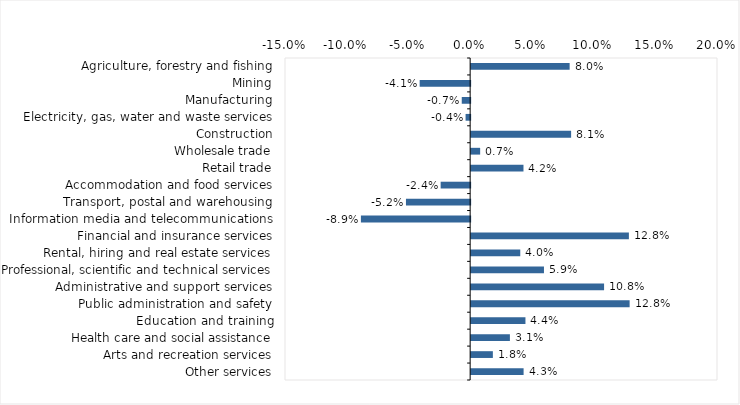
| Category | This week |
|---|---|
| Agriculture, forestry and fishing | 0.08 |
| Mining | -0.041 |
| Manufacturing | -0.007 |
| Electricity, gas, water and waste services | -0.004 |
| Construction | 0.081 |
| Wholesale trade | 0.007 |
| Retail trade | 0.042 |
| Accommodation and food services | -0.024 |
| Transport, postal and warehousing | -0.052 |
| Information media and telecommunications | -0.088 |
| Financial and insurance services | 0.128 |
| Rental, hiring and real estate services | 0.04 |
| Professional, scientific and technical services | 0.059 |
| Administrative and support services | 0.108 |
| Public administration and safety | 0.128 |
| Education and training | 0.044 |
| Health care and social assistance | 0.031 |
| Arts and recreation services | 0.018 |
| Other services | 0.042 |